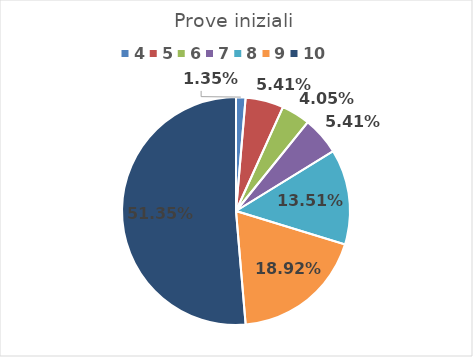
| Category | Series 0 |
|---|---|
| 4.0 | 0.014 |
| 5.0 | 0.054 |
| 6.0 | 0.041 |
| 7.0 | 0.054 |
| 8.0 | 0.135 |
| 9.0 | 0.189 |
| 10.0 | 0.514 |